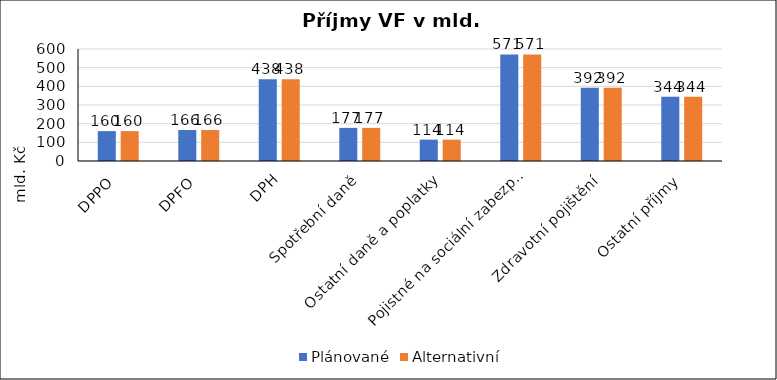
| Category | Plánované | Alternativní |
|---|---|---|
| DPPO | 159.98 | 159.98 |
| DPFO | 165.8 | 165.8 |
| DPH | 438.374 | 438.374 |
| Spotřební daně | 177.365 | 177.365 |
| Ostatní daně a poplatky | 114.376 | 114.376 |
| Pojistné na sociální zabezpečení | 570.6 | 570.6 |
| Zdravotní pojištění | 392.282 | 392.282 |
| Ostatní příjmy | 344.323 | 344.323 |